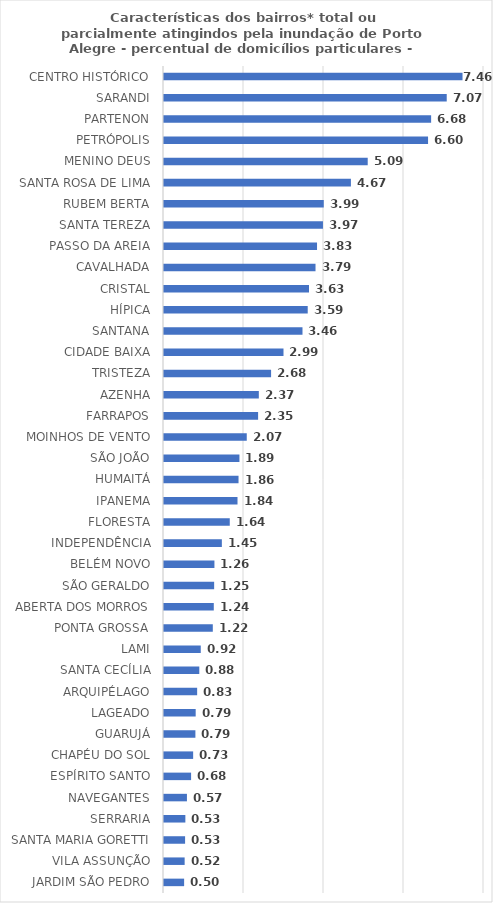
| Category | Percentual |
|---|---|
| CENTRO HISTÓRICO | 7.463 |
| SARANDI | 7.068 |
| PARTENON | 6.678 |
| PETRÓPOLIS | 6.601 |
| MENINO DEUS | 5.093 |
| SANTA ROSA DE LIMA | 4.673 |
| RUBEM BERTA | 3.994 |
| SANTA TEREZA | 3.974 |
| PASSO DA AREIA | 3.826 |
| CAVALHADA | 3.788 |
| CRISTAL | 3.625 |
| HÍPICA | 3.593 |
| SANTANA | 3.462 |
| CIDADE BAIXA | 2.987 |
| TRISTEZA | 2.677 |
| AZENHA | 2.371 |
| FARRAPOS | 2.353 |
| MOINHOS DE VENTO | 2.069 |
| SÃO JOÃO | 1.886 |
| HUMAITÁ | 1.863 |
| IPANEMA | 1.838 |
| FLORESTA | 1.644 |
| INDEPENDÊNCIA | 1.446 |
| BELÉM NOVO | 1.261 |
| SÃO GERALDO | 1.254 |
| ABERTA DOS MORROS | 1.245 |
| PONTA GROSSA | 1.22 |
| LAMI | 0.919 |
| SANTA CECÍLIA | 0.882 |
| ARQUIPÉLAGO | 0.829 |
| LAGEADO | 0.792 |
| GUARUJÁ | 0.785 |
| CHAPÉU DO SOL | 0.729 |
| ESPÍRITO SANTO | 0.677 |
| NAVEGANTES | 0.573 |
| SERRARIA | 0.534 |
| SANTA MARIA GORETTI | 0.527 |
| VILA ASSUNÇÃO | 0.516 |
| JARDIM SÃO PEDRO | 0.503 |